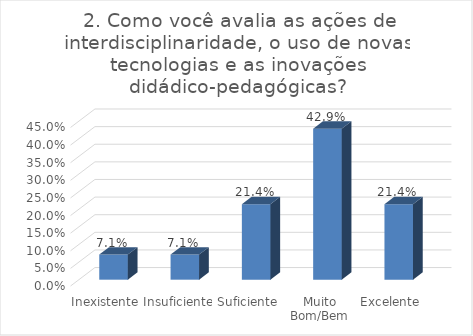
| Category | 2. Como você avalia as ações de interdisciplinaridade, o uso de novas tecnologias e as inovações didádico-pedagógicas? |
|---|---|
| Inexistente | 0.071 |
| Insuficiente | 0.071 |
| Suficiente | 0.214 |
| Muito Bom/Bem | 0.429 |
| Excelente | 0.214 |